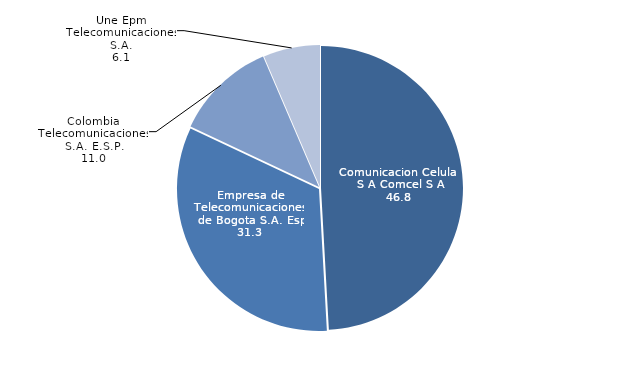
| Category | Series 0 |
|---|---|
| Comunicacion Celular S A Comcel S A | 46.775 |
| Empresa de Telecomunicaciones de Bogota S.A. Esp | 31.312 |
| Colombia Telecomunicaciones S.A. E.S.P. | 11.006 |
| Une Epm Telecomunicaciones S.A. | 6.14 |